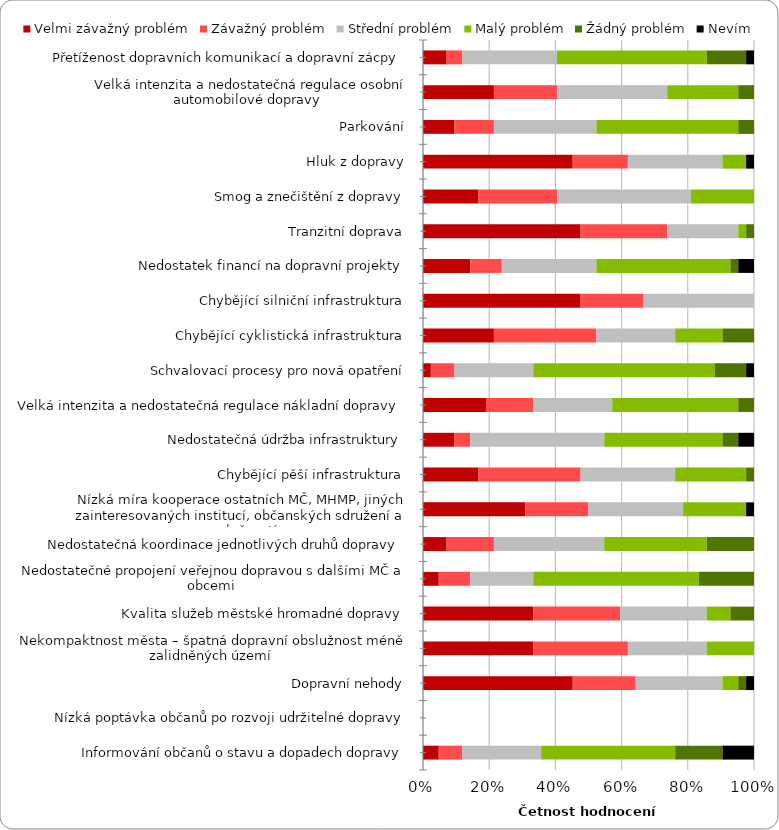
| Category | Velmi závažný problém | Závažný problém | Střední problém | Malý problém | Žádný problém | Nevím |
|---|---|---|---|---|---|---|
|  Přetíženost dopravních komunikací a dopravní zácpy  | 3 | 2 | 12 | 19 | 5 | 1 |
|  Velká intenzita a nedostatečná regulace osobní automobilové dopravy  | 9 | 8 | 14 | 9 | 2 | 0 |
|  Parkování  | 4 | 5 | 13 | 18 | 2 | 0 |
|  Hluk z dopravy  | 19 | 7 | 12 | 3 | 0 | 1 |
|  Smog a znečištění z dopravy  | 7 | 10 | 17 | 8 | 0 | 0 |
|  Tranzitní doprava  | 20 | 11 | 9 | 1 | 1 | 0 |
|  Nedostatek financí na dopravní projekty  | 6 | 4 | 12 | 17 | 1 | 2 |
|  Chybějící silniční infrastruktura  | 20 | 8 | 14 | 0 | 0 | 0 |
|  Chybějící cyklistická infrastruktura  | 9 | 13 | 10 | 6 | 4 | 0 |
|  Schvalovací procesy pro nová opatření | 1 | 3 | 10 | 23 | 4 | 1 |
|  Velká intenzita a nedostatečná regulace nákladní dopravy  | 8 | 6 | 10 | 16 | 2 | 0 |
|  Nedostatečná údržba infrastruktury  | 4 | 2 | 17 | 15 | 2 | 2 |
|  Chybějící pěší infrastruktura  | 7 | 13 | 12 | 9 | 1 | 0 |
|  Nízká míra kooperace ostatních MČ, MHMP, jiných zainteresovaných institucí, občanských sdružení a společností  | 13 | 8 | 12 | 8 | 0 | 1 |
|  Nedostatečná koordinace jednotlivých druhů dopravy  | 3 | 6 | 14 | 13 | 6 | 0 |
|  Nedostatečné propojení veřejnou dopravou s dalšími MČ a obcemi  | 2 | 4 | 8 | 21 | 7 | 0 |
|  Kvalita služeb městské hromadné dopravy  | 14 | 11 | 11 | 3 | 3 | 0 |
|  Nekompaktnost města – špatná dopravní obslužnost méně zalidněných území  | 14 | 12 | 10 | 6 | 0 | 0 |
|  Dopravní nehody  | 19 | 8 | 11 | 2 | 1 | 1 |
|  Nízká poptávka občanů po rozvoji udržitelné dopravy | 0 | 0 | 0 | 0 | 0 | 0 |
|  Informování občanů o stavu a dopadech dopravy | 2 | 3 | 10 | 17 | 6 | 4 |